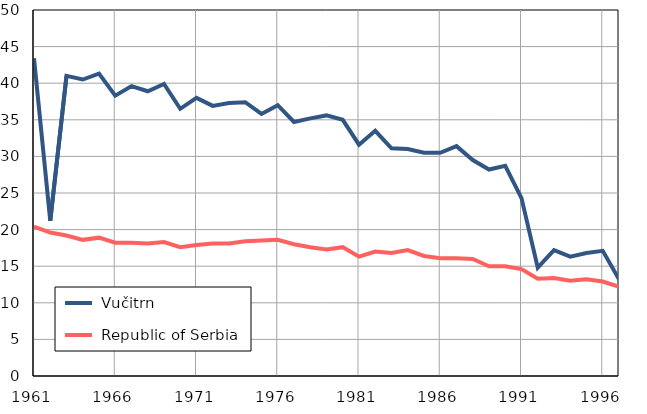
| Category |  Vučitrn |  Republic of Serbia |
|---|---|---|
| 1961.0 | 43.4 | 20.4 |
| 1962.0 | 21.2 | 19.6 |
| 1963.0 | 41 | 19.2 |
| 1964.0 | 40.5 | 18.6 |
| 1965.0 | 41.3 | 18.9 |
| 1966.0 | 38.3 | 18.2 |
| 1967.0 | 39.6 | 18.2 |
| 1968.0 | 38.9 | 18.1 |
| 1969.0 | 39.9 | 18.3 |
| 1970.0 | 36.5 | 17.6 |
| 1971.0 | 38 | 17.9 |
| 1972.0 | 36.9 | 18.1 |
| 1973.0 | 37.3 | 18.1 |
| 1974.0 | 37.4 | 18.4 |
| 1975.0 | 35.8 | 18.5 |
| 1976.0 | 37 | 18.6 |
| 1977.0 | 34.7 | 18 |
| 1978.0 | 35.2 | 17.6 |
| 1979.0 | 35.6 | 17.3 |
| 1980.0 | 35 | 17.6 |
| 1981.0 | 31.6 | 16.3 |
| 1982.0 | 33.5 | 17 |
| 1983.0 | 31.1 | 16.8 |
| 1984.0 | 31 | 17.2 |
| 1985.0 | 30.5 | 16.4 |
| 1986.0 | 30.5 | 16.1 |
| 1987.0 | 31.4 | 16.1 |
| 1988.0 | 29.5 | 16 |
| 1989.0 | 28.2 | 15 |
| 1990.0 | 28.7 | 15 |
| 1991.0 | 24.3 | 14.6 |
| 1992.0 | 14.8 | 13.3 |
| 1993.0 | 17.2 | 13.4 |
| 1994.0 | 16.3 | 13 |
| 1995.0 | 16.8 | 13.2 |
| 1996.0 | 17.1 | 12.9 |
| 1997.0 | 13.2 | 12.2 |